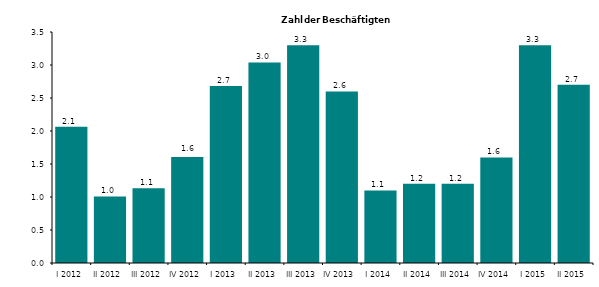
| Category | Series 0 |
|---|---|
| I 2012 | 2.063 |
| II 2012 | 1.009 |
| III 2012 | 1.132 |
| IV 2012 | 1.607 |
| I 2013 | 2.682 |
| II 2013 | 3.039 |
| III 2013 | 3.3 |
| IV 2013 | 2.6 |
| I 2014 | 1.1 |
| II 2014 | 1.2 |
| III 2014 | 1.2 |
| IV 2014 | 1.6 |
| I 2015 | 3.3 |
| II 2015 | 2.7 |